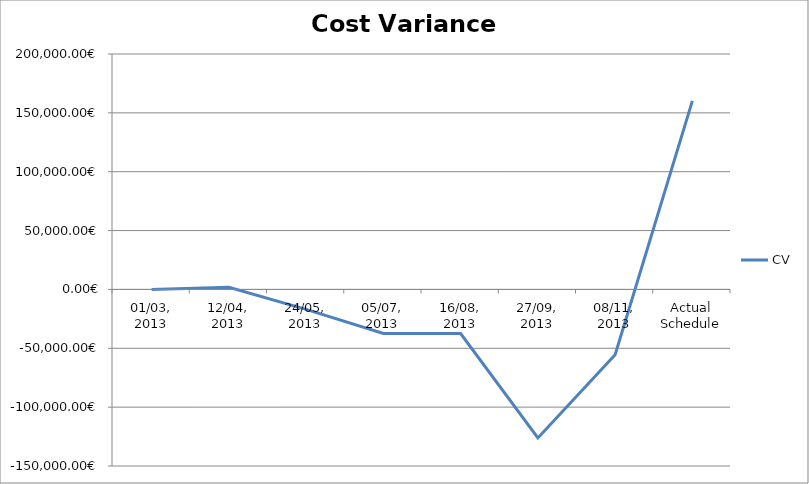
| Category | CV |
|---|---|
| 01/03, 2013 | 0 |
| 12/04, 2013 | 1785.8 |
| 24/05, 2013 | -16964.2 |
| 05/07, 2013 | -37451.8 |
| 16/08, 2013 | -37451.8 |
| 27/09, 2013 | -126181 |
| 08/11, 2013 | -55420.87 |
| Actual Schedule | 160141.273 |